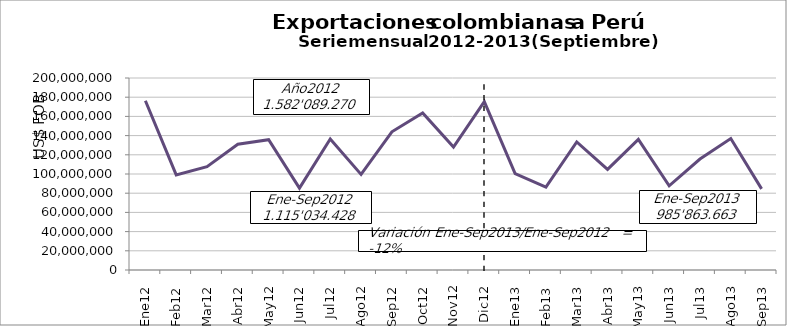
| Category | Series 0 |
|---|---|
| 0 | 176325203.17 |
| 1 | 99028180.79 |
| 2 | 107623866.41 |
| 3 | 130984151.36 |
| 4 | 135768823.69 |
| 5 | 85300295.87 |
| 6 | 136433221.25 |
| 7 | 99592333.99 |
| 8 | 143978351.77 |
| 9 | 163509169.07 |
| 10 | 128099479.77 |
| 11 | 175446193.35 |
| 12 | 100491613.05 |
| 13 | 86426192.3 |
| 14 | 133330711.38 |
| 15 | 104781376.94 |
| 16 | 136140166.81 |
| 17 | 87699252.67 |
| 18 | 115590888.38 |
| 19 | 136906926.72 |
| 20 | 84496534.6 |